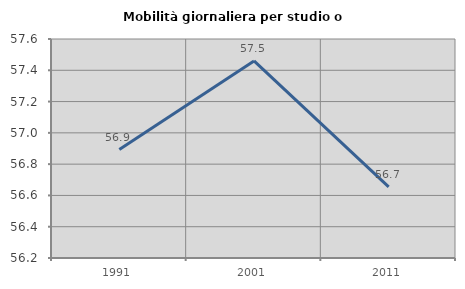
| Category | Mobilità giornaliera per studio o lavoro |
|---|---|
| 1991.0 | 56.893 |
| 2001.0 | 57.46 |
| 2011.0 | 56.655 |